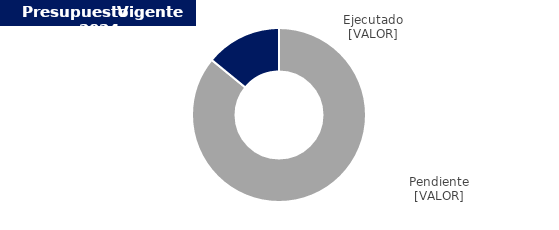
| Category | Series 0 |
|---|---|
| 0 | 6343679697.18 |
| 1 | 1039801302.82 |